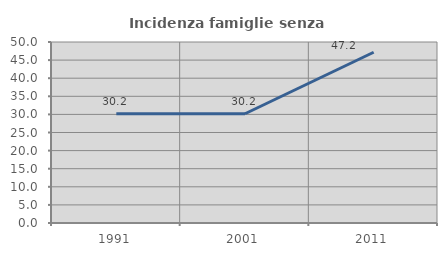
| Category | Incidenza famiglie senza nuclei |
|---|---|
| 1991.0 | 30.193 |
| 2001.0 | 30.184 |
| 2011.0 | 47.166 |